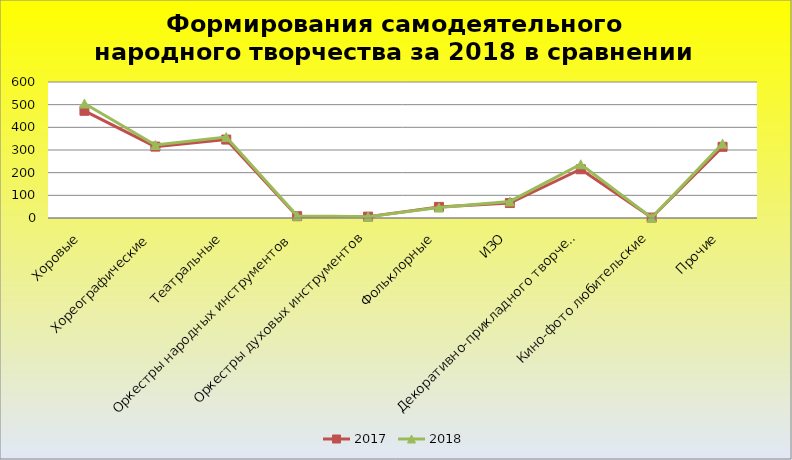
| Category | 2017 | 2018 |
|---|---|---|
| Хоровые | 473 | 505 |
| Хореографические | 315 | 322 |
| Театральные | 346 | 357 |
| Оркестры народных инструментов | 8 | 10 |
| Оркестры духовых инструментов | 6 | 6 |
| Фольклорные | 49 | 46 |
| ИЗО | 66 | 73 |
| Декоративно-прикладного творчества | 215 | 237 |
| Кино-фото любительские | 2 | 1 |
| Прочие | 314 | 328 |